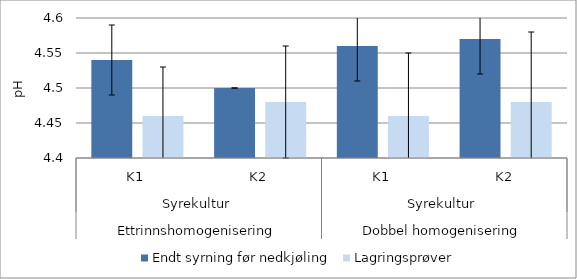
| Category | Endt syrning før nedkjøling | Lagringsprøver |
|---|---|---|
| 0 | 4.54 | 4.46 |
| 1 | 4.5 | 4.48 |
| 2 | 4.56 | 4.46 |
| 3 | 4.57 | 4.48 |